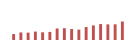
| Category | Importações (2) |
|---|---|
| 0 | 62681.056 |
| 1 | 79621.593 |
| 2 | 77709.867 |
| 3 | 88593.929 |
| 4 | 80744.22 |
| 5 | 85348.563 |
| 6 | 121368.935 |
| 7 | 124143.971 |
| 8 | 115571.707 |
| 9 | 109068.986 |
| 10 | 136178.726 |
| 11 | 153404.387 |
| 12 | 167744.463 |
| 13 | 164346.623 |
| 14 | 165333.113 |
| 15 | 194581.12 |